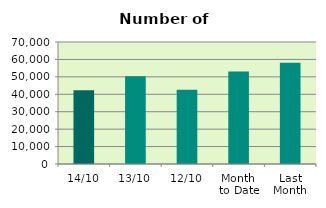
| Category | Series 0 |
|---|---|
| 14/10 | 42358 |
| 13/10 | 50408 |
| 12/10 | 42566 |
| Month 
to Date | 53094.2 |
| Last
Month | 58072.091 |